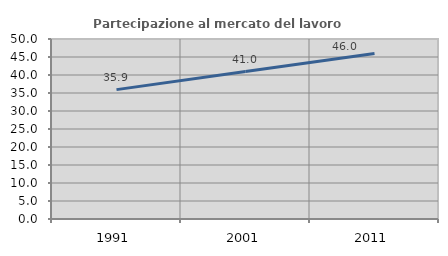
| Category | Partecipazione al mercato del lavoro  femminile |
|---|---|
| 1991.0 | 35.938 |
| 2001.0 | 40.969 |
| 2011.0 | 45.964 |